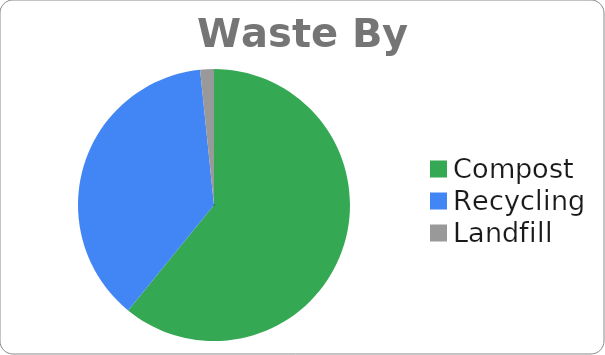
| Category | TOTALS  |
|---|---|
| Compost  | 477.1 |
| Recycling  | 293.8 |
| Landfill  | 12.8 |